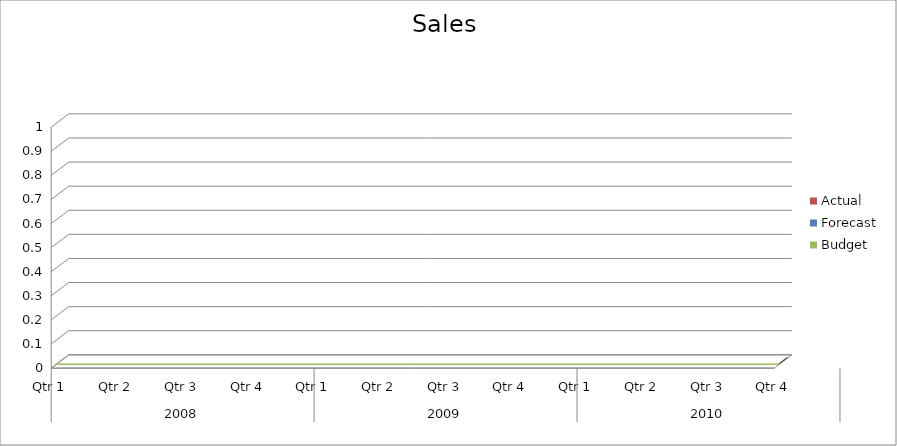
| Category | Budget | Forecast | Actual |
|---|---|---|---|
| 0 | 1820 | 2950 | 2590 |
| 1 | 1590 | 1070 | 3100 |
| 2 | 1900 | 3250 | 3330 |
| 3 | 2200 | 1750 | 2440 |
| 4 | 2160 | 2940 | 3330 |
| 5 | 1010 | 3260 | 3130 |
| 6 | 1060 | 3160 | 1150 |
| 7 | 2250 | 2850 | 3360 |
| 8 | 3040 | 660 | 1830 |
| 9 | 1850 | 960 | 850 |
| 10 | 3030 | 510 | 2690 |
| 11 | 2120 | 2490 | 1520 |